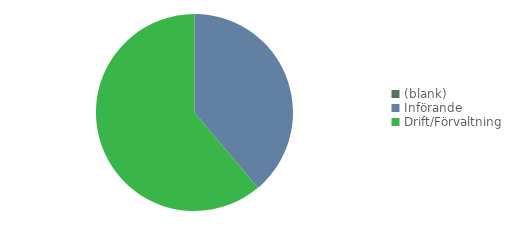
| Category | Summa |
|---|---|
| (blank) | 0 |
| Införande | 356 |
| Drift/Förvaltning | 560 |